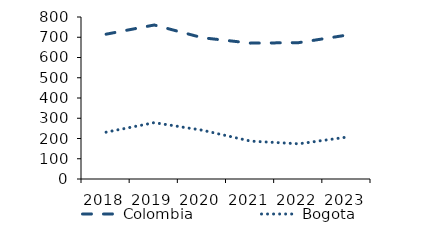
| Category | Colombia | Bogota |
|---|---|---|
| 2018.0 | 715.104 | 231.298 |
| 2019.0 | 760.47 | 278.248 |
| 2020.0 | 697.591 | 240.861 |
| 2021.0 | 670.959 | 187.113 |
| 2022.0 | 673.382 | 173.801 |
| 2023.0 | 710.648 | 206.87 |